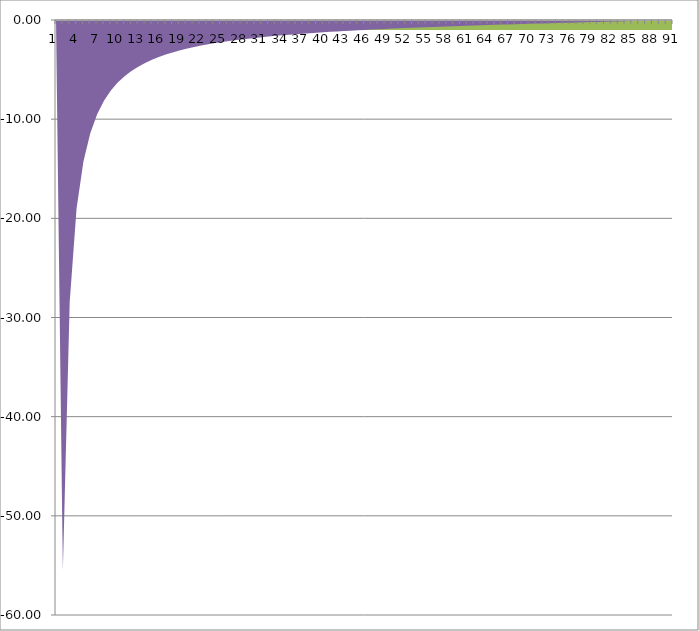
| Category | Block yddot | 100000 max 0.00 xddot/g |
|---|---|---|
| 0 | 0 | 0 |
| 1 | -0.968 | -55.469 |
| 2 | -0.992 | -28.403 |
| 3 | -0.996 | -19.012 |
| 4 | -0.998 | -14.271 |
| 5 | -0.999 | -11.415 |
| 6 | -0.999 | -9.506 |
| 7 | -0.999 | -8.139 |
| 8 | -0.999 | -7.112 |
| 9 | -1 | -6.311 |
| 10 | -1 | -5.669 |
| 11 | -1 | -5.143 |
| 12 | -1 | -4.704 |
| 13 | -1 | -4.331 |
| 14 | -1 | -4.01 |
| 15 | -1 | -3.731 |
| 16 | -1 | -3.487 |
| 17 | -1 | -3.27 |
| 18 | -1 | -3.077 |
| 19 | -1 | -2.904 |
| 20 | -1 | -2.747 |
| 21 | -1 | -2.605 |
| 22 | -1 | -2.475 |
| 23 | -1 | -2.356 |
| 24 | -1 | -2.246 |
| 25 | -1 | -2.144 |
| 26 | -1 | -2.05 |
| 27 | -1 | -1.963 |
| 28 | -1 | -1.881 |
| 29 | -1 | -1.804 |
| 30 | -1 | -1.732 |
| 31 | -1 | -1.664 |
| 32 | -1 | -1.6 |
| 33 | -1 | -1.54 |
| 34 | -1 | -1.483 |
| 35 | -1 | -1.428 |
| 36 | -1 | -1.376 |
| 37 | -1 | -1.327 |
| 38 | -1 | -1.28 |
| 39 | -1 | -1.235 |
| 40 | -1 | -1.192 |
| 41 | -1 | -1.15 |
| 42 | -1 | -1.111 |
| 43 | -1 | -1.072 |
| 44 | -1 | -1.036 |
| 45 | -1 | -1 |
| 46 | -1 | -0.966 |
| 47 | -1 | -0.932 |
| 48 | -1 | -0.9 |
| 49 | -1 | -0.869 |
| 50 | -1 | -0.839 |
| 51 | -1 | -0.81 |
| 52 | -1 | -0.781 |
| 53 | -1 | -0.754 |
| 54 | -1 | -0.727 |
| 55 | -1 | -0.7 |
| 56 | -1 | -0.674 |
| 57 | -1 | -0.649 |
| 58 | -1 | -0.625 |
| 59 | -1 | -0.601 |
| 60 | -1 | -0.577 |
| 61 | -1 | -0.554 |
| 62 | -1 | -0.532 |
| 63 | -1 | -0.51 |
| 64 | -1 | -0.488 |
| 65 | -1 | -0.466 |
| 66 | -1 | -0.445 |
| 67 | -1 | -0.424 |
| 68 | -1 | -0.404 |
| 69 | -1 | -0.384 |
| 70 | -1 | -0.364 |
| 71 | -1 | -0.344 |
| 72 | -1 | -0.325 |
| 73 | -1 | -0.306 |
| 74 | -1 | -0.287 |
| 75 | -1 | -0.268 |
| 76 | -1 | -0.249 |
| 77 | -1 | -0.231 |
| 78 | -1 | -0.213 |
| 79 | -1 | -0.194 |
| 80 | -1 | -0.176 |
| 81 | -1 | -0.158 |
| 82 | -1 | -0.141 |
| 83 | -1 | -0.123 |
| 84 | -1 | -0.105 |
| 85 | -1 | -0.087 |
| 86 | -1 | -0.07 |
| 87 | -1 | -0.052 |
| 88 | -1 | -0.035 |
| 89 | -1 | -0.017 |
| 90 | -1 | 0 |